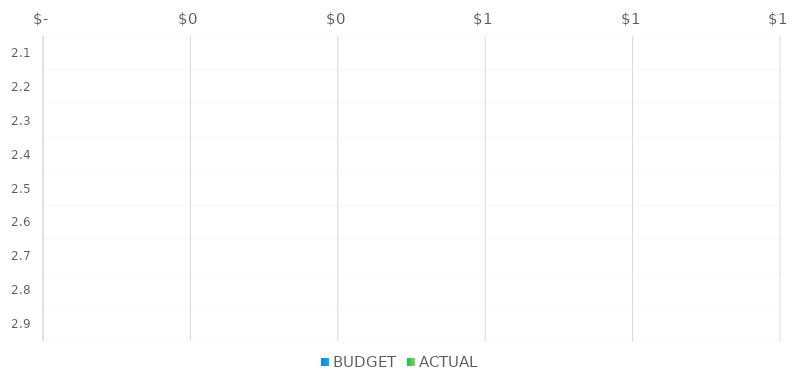
| Category | BUDGET | ACTUAL |
|---|---|---|
| 2.1 |  | 0 |
| 2.2 |  | 0 |
| 2.3 |  | 0 |
| 2.4 |  | 0 |
| 2.5 |  | 0 |
| 2.6 |  | 0 |
| 2.7 |  | 0 |
| 2.8 |  | 0 |
| 2.9 |  | 0 |